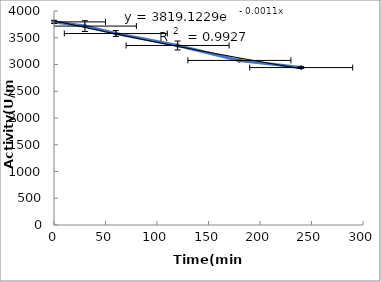
| Category | Series 0 |
|---|---|
| 0.0 | 3796.157 |
| 30.0 | 3718.089 |
| 60.0 | 3578.724 |
| 120.0 | 3355.51 |
| 180.0 | 3076.202 |
| 240.0 | 2942.62 |